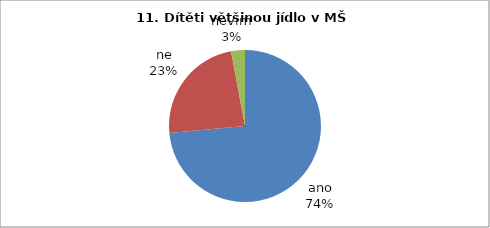
| Category | 11. |
|---|---|
| ano | 25 |
| ne | 8 |
| nevím | 1 |